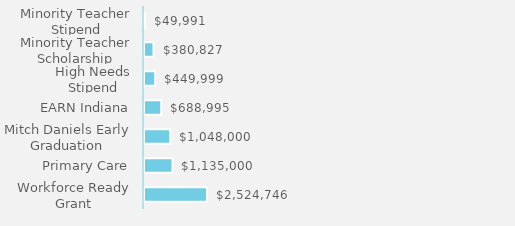
| Category | Series 0 |
|---|---|
| Workforce Ready Grant | 2524746 |
| Primary Care | 1135000 |
| Mitch Daniels Early Graduation | 1048000 |
| EARN Indiana | 688995 |
| High Needs Stipend | 449999 |
| Minority Teacher Scholarship | 380827 |
| Minority Teacher Stipend | 49991 |